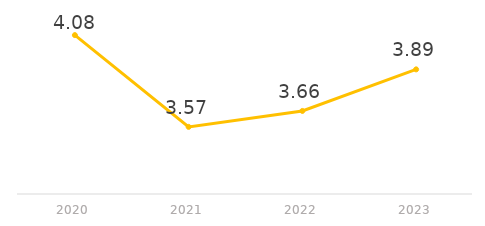
| Category | Series 0 |
|---|---|
| 2020.0 | 4.083 |
| 2021.0 | 3.573 |
| 2022.0 | 3.661 |
| 2023.0 | 3.892 |